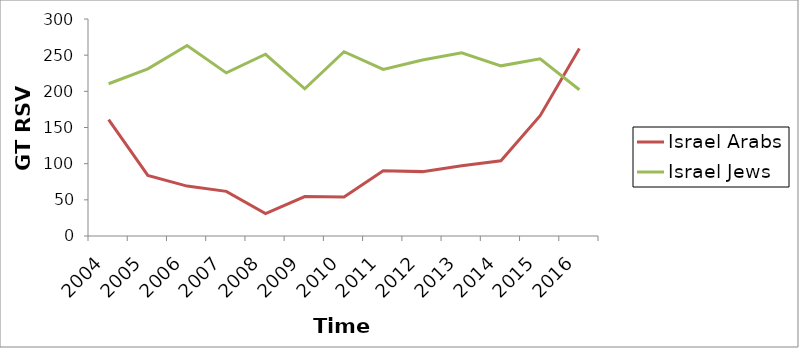
| Category | Israel Arabs | Israel Jews |
|---|---|---|
| 2004.0 | 161 | 210.5 |
| 2005.0 | 83.75 | 231 |
| 2006.0 | 69 | 263.25 |
| 2007.0 | 61.75 | 225.5 |
| 2008.0 | 31 | 251.25 |
| 2009.0 | 54.5 | 203.5 |
| 2010.0 | 54 | 254.75 |
| 2011.0 | 90.25 | 230.25 |
| 2012.0 | 89 | 243.25 |
| 2013.0 | 97.25 | 253.25 |
| 2014.0 | 104 | 235.25 |
| 2015.0 | 166.25 | 245 |
| 2016.0 | 259.25 | 202.25 |